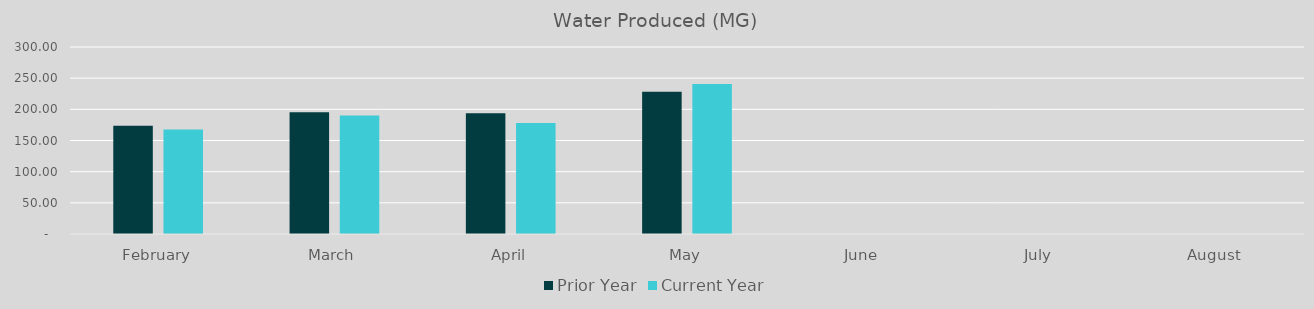
| Category | Prior Year | Current Year |
|---|---|---|
| February | 173.847 | 167.532 |
| March | 195.333 | 190.306 |
| April | 193.551 | 178.22 |
| May | 228.091 | 240.625 |
| June | 0 | 0 |
| July | 0 | 0 |
| August | 0 | 0 |